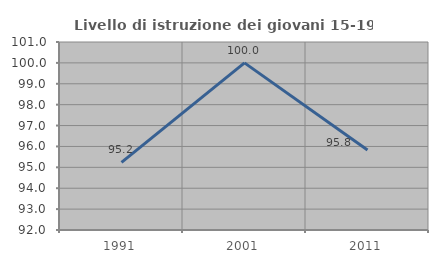
| Category | Livello di istruzione dei giovani 15-19 anni |
|---|---|
| 1991.0 | 95.238 |
| 2001.0 | 100 |
| 2011.0 | 95.833 |